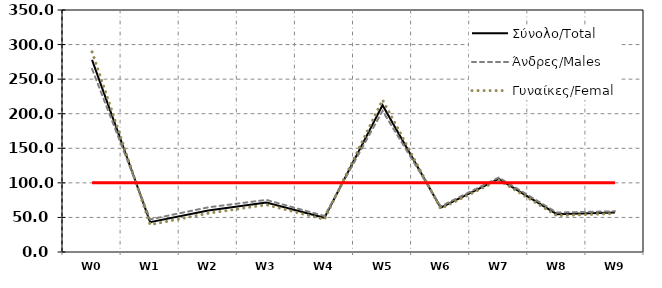
| Category | Σύνολο/Total | Άνδρες/Males | Γυναίκες/Females | Series 3 |
|---|---|---|---|---|
| W0 | 277.799 | 264.715 | 289.424 | 100 |
| W1 | 43.141 | 47.192 | 39.489 | 100 |
| W2 | 60.111 | 64.624 | 55.994 | 100 |
| W3 | 71.657 | 75.332 | 68.295 | 100 |
| W4 | 49.549 | 52.067 | 47.249 | 100 |
| W5 | 212.397 | 204.074 | 220.015 | 100 |
| W6 | 64.267 | 65.975 | 62.718 | 100 |
| W7 | 105.852 | 107.74 | 104.151 | 100 |
| W8 | 54.643 | 57.003 | 52.572 | 100 |
| W9 | 57.225 | 58.954 | 55.699 | 100 |